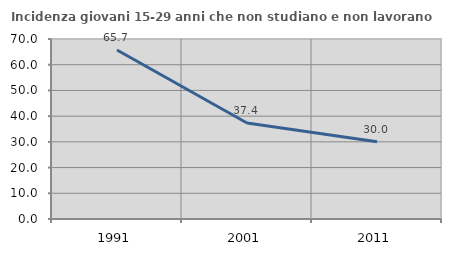
| Category | Incidenza giovani 15-29 anni che non studiano e non lavorano  |
|---|---|
| 1991.0 | 65.714 |
| 2001.0 | 37.358 |
| 2011.0 | 30.025 |